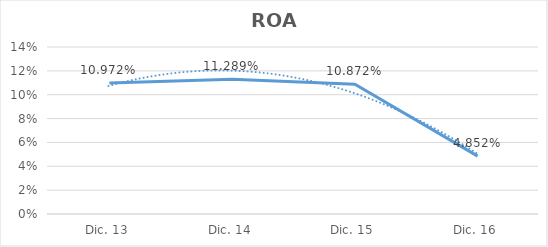
| Category | Series 0 |
|---|---|
| Dic. 13 | 0.11 |
| Dic. 14 | 0.113 |
| Dic. 15 | 0.109 |
| Dic. 16 | 0.049 |